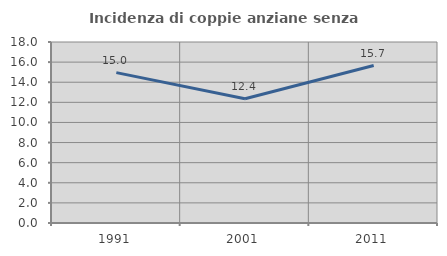
| Category | Incidenza di coppie anziane senza figli  |
|---|---|
| 1991.0 | 14.953 |
| 2001.0 | 12.36 |
| 2011.0 | 15.663 |